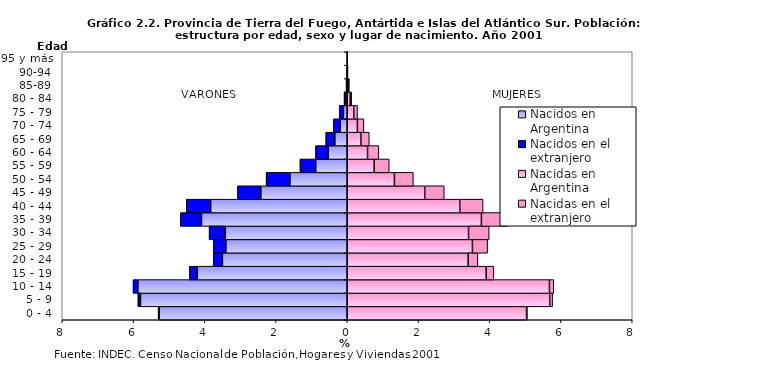
| Category | Nacidos en Argentina | Nacidos en el extranjero | Nacidas en Argentina | Nacidas en el extranjero |
|---|---|---|---|---|
| 0 - 4 | -5.279 | -0.029 | 5.033 | 0.022 |
| 5 - 9 | -5.803 | -0.072 | 5.684 | 0.081 |
| 10 - 14 | -5.877 | -0.135 | 5.676 | 0.121 |
| 15 - 19 | -4.211 | -0.22 | 3.899 | 0.216 |
| 20 - 24 | -3.504 | -0.256 | 3.393 | 0.272 |
| 25 - 29 | -3.406 | -0.35 | 3.514 | 0.425 |
| 30 - 34 | -3.425 | -0.452 | 3.405 | 0.578 |
| 35 - 39 | -4.091 | -0.592 | 3.765 | 0.738 |
| 40 - 44 | -3.834 | -0.684 | 3.16 | 0.653 |
| 45 - 49 | -2.425 | -0.656 | 2.177 | 0.546 |
| 50 - 54 | -1.609 | -0.668 | 1.324 | 0.531 |
| 55 - 59 | -0.884 | -0.442 | 0.755 | 0.423 |
| 60 - 64 | -0.532 | -0.357 | 0.57 | 0.317 |
| 65 - 69 | -0.348 | -0.254 | 0.383 | 0.234 |
| 70 - 74 | -0.2 | -0.189 | 0.285 | 0.182 |
| 75 - 79 | -0.107 | -0.118 | 0.185 | 0.103 |
| 80 - 84 | -0.038 | -0.05 | 0.082 | 0.043 |
| 85-89 | -0.011 | -0.021 | 0.03 | 0.03 |
| 90-94 | -0.006 | -0.009 | 0.009 | 0.011 |
| 95 y más | -0.002 | 0 | 0.001 | 0.002 |